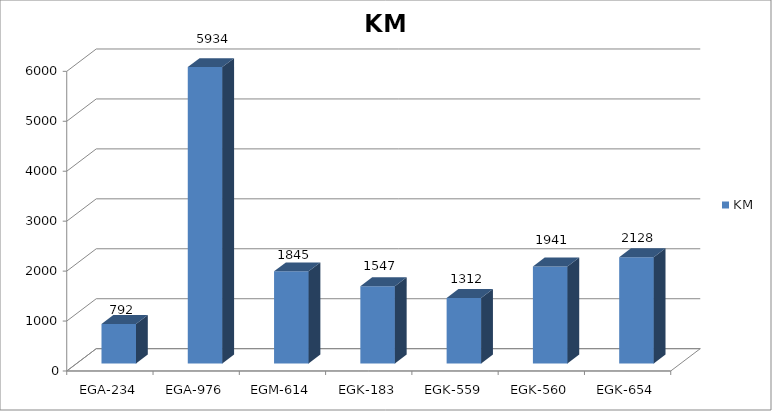
| Category | KM |
|---|---|
| EGA-234 | 792 |
| EGA-976 | 5934 |
| EGM-614 | 1845 |
| EGK-183 | 1547 |
| EGK-559 | 1312 |
| EGK-560 | 1941 |
| EGK-654 | 2128 |